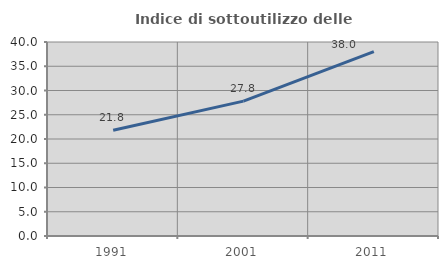
| Category | Indice di sottoutilizzo delle abitazioni  |
|---|---|
| 1991.0 | 21.791 |
| 2001.0 | 27.814 |
| 2011.0 | 38.014 |